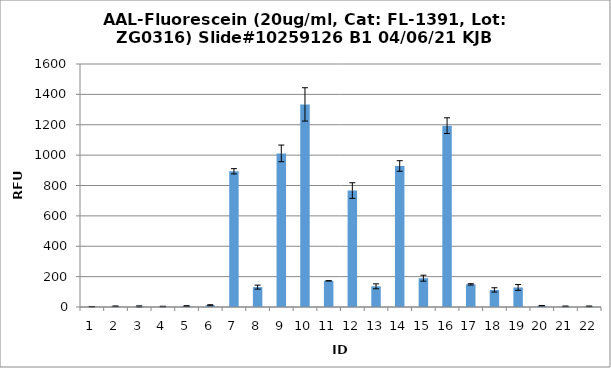
| Category | Series 0 |
|---|---|
| 0 | 2 |
| 1 | 4.75 |
| 2 | 4 |
| 3 | 3 |
| 4 | 5.75 |
| 5 | 11.75 |
| 6 | 893.5 |
| 7 | 131 |
| 8 | 1011.5 |
| 9 | 1334 |
| 10 | 172.25 |
| 11 | 766.75 |
| 12 | 136.25 |
| 13 | 928.5 |
| 14 | 189.75 |
| 15 | 1194 |
| 16 | 149 |
| 17 | 112.5 |
| 18 | 128.75 |
| 19 | 8.25 |
| 20 | 4.25 |
| 21 | 4.25 |